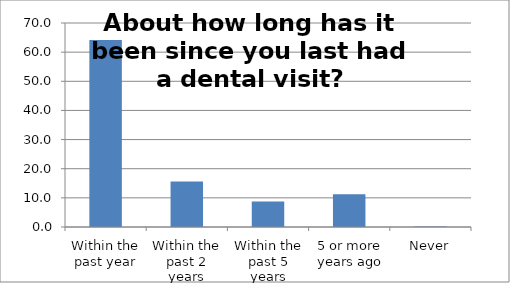
| Category | Series 0 |
|---|---|
| Within the past year | 64.203 |
| Within the past 2 years | 15.588 |
| Within the past 5 years | 8.77 |
| 5 or more years ago | 11.254 |
| Never | 0.185 |